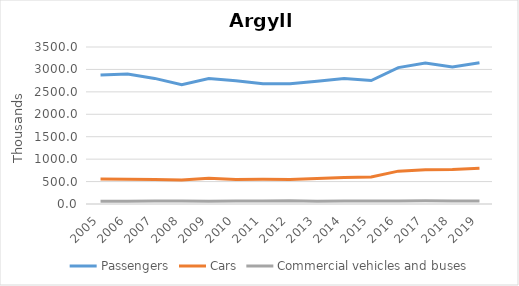
| Category | Passengers | Cars | Commercial vehicles and buses |
|---|---|---|---|
| 2005.0 | 2875.174 | 559.051 | 61.247 |
| 2006.0 | 2897.496 | 553.647 | 63.883 |
| 2007.0 | 2800.061 | 547.257 | 64.867 |
| 2008.0 | 2658.323 | 536.609 | 67.679 |
| 2009.0 | 2796.344 | 573.069 | 62.22 |
| 2010.0 | 2748.429 | 547.976 | 64.931 |
| 2011.0 | 2678.376 | 550.398 | 68.738 |
| 2012.0 | 2681.943 | 545.93 | 72.833 |
| 2013.0 | 2737.568 | 569.499 | 62.752 |
| 2014.0 | 2800.2 | 590.5 | 65.4 |
| 2015.0 | 2752.3 | 603.5 | 69.35 |
| 2016.0 | 3041 | 732.4 | 68.12 |
| 2017.0 | 3140.4 | 765.8 | 69.74 |
| 2018.0 | 3052.5 | 769.1 | 68.4 |
| 2019.0 | 3148.7 | 797.4 | 68.8 |